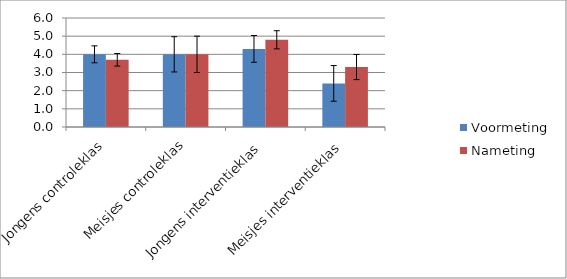
| Category | Voormeting | Nameting |
|---|---|---|
| Jongens controleklas | 4 | 3.7 |
| Meisjes controleklas | 4 | 4 |
| Jongens interventieklas | 4.3 | 4.8 |
| Meisjes interventieklas | 2.4 | 3.3 |